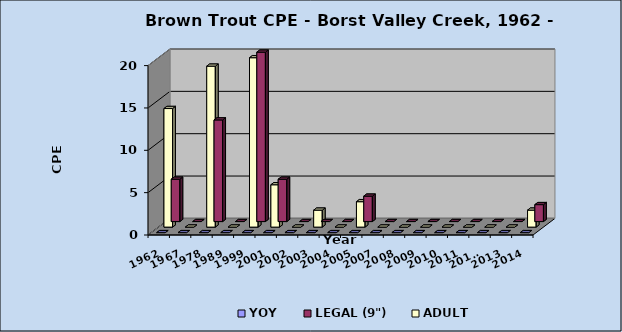
| Category | YOY | LEGAL (9") | ADULT |
|---|---|---|---|
| 1962 | 0 | 5 | 14 |
| 1967 | 0 | 0 | 0 |
| 1978 | 0 | 12 | 19 |
| 1989 | 0 | 0 | 0 |
| 1999 | 0 | 20 | 20 |
| 2001 | 0 | 5 | 5 |
| 2002 | 0 | 0 | 0 |
| 2003 | 0 | 0 | 2 |
| 2004 | 0 | 0 | 0 |
| 2005 | 0 | 3 | 3 |
| 2007 | 0 | 0 | 0 |
| 2008 | 0 | 0 | 0 |
| 2009 | 0 | 0 | 0 |
| 2010 | 0 | 0 | 0 |
| 2011 | 0 | 0 | 0 |
| 2012* | 0 | 0 | 0 |
| 2013 | 0 | 0 | 0 |
| 2014 | 0 | 2 | 2 |